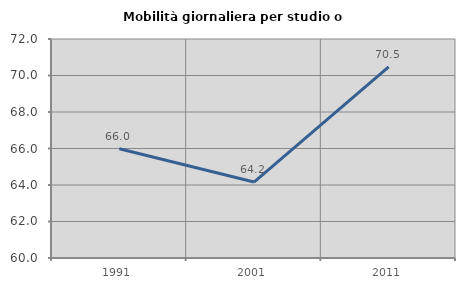
| Category | Mobilità giornaliera per studio o lavoro |
|---|---|
| 1991.0 | 65.99 |
| 2001.0 | 64.16 |
| 2011.0 | 70.472 |